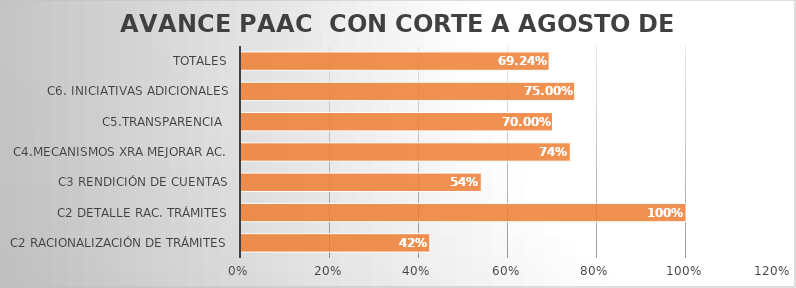
| Category | % AVANCE |
|---|---|
| C2 RACIONALIZACIÓN DE TRÁMITES | 0.424 |
| C2 DETALLE RAC. TRÁMITES | 1 |
| C3 RENDICIÓN DE CUENTAS | 0.54 |
| C4.MECANISMOS XRA MEJORAR AC. | 0.74 |
| C5.TRANSPARENCIA  | 0.7 |
| C6. INICIATIVAS ADICIONALES | 0.75 |
| TOTALES | 0.692 |